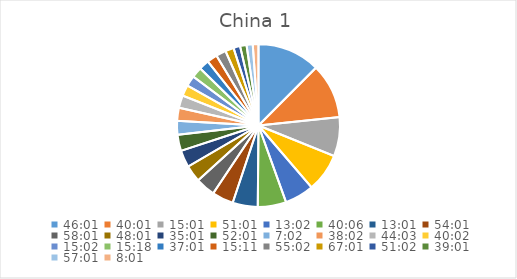
| Category | Series 0 |
|---|---|
| 1.917361111111111 | 11.983 |
| 1.667361111111111 | 10.48 |
| 0.6256944444444444 | 7.484 |
| 2.1256944444444446 | 7.322 |
| 0.5430555555555555 | 5.575 |
| 1.6708333333333334 | 5.419 |
| 0.5423611111111112 | 4.799 |
| 2.2506944444444446 | 4.086 |
| 2.417361111111111 | 3.732 |
| 2.0006944444444446 | 3.232 |
| 1.4590277777777778 | 3.232 |
| 2.167361111111111 | 3.083 |
| 0.29305555555555557 | 2.638 |
| 1.5847222222222221 | 2.49 |
| 1.8354166666666665 | 2.392 |
| 1.6680555555555554 | 2.099 |
| 0.6263888888888889 | 2.002 |
| 0.6375000000000001 | 2.002 |
| 1.542361111111111 | 1.953 |
| 0.6326388888888889 | 1.953 |
| 2.2930555555555556 | 1.905 |
| 2.792361111111111 | 1.614 |
| 2.1263888888888887 | 1.278 |
| 1.6256944444444443 | 1.23 |
| 2.3756944444444446 | 1.182 |
| 0.3340277777777778 | 1.086 |